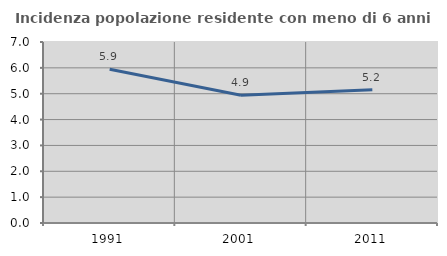
| Category | Incidenza popolazione residente con meno di 6 anni |
|---|---|
| 1991.0 | 5.945 |
| 2001.0 | 4.943 |
| 2011.0 | 5.153 |